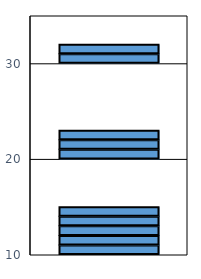
| Category | 9/1/2013 |
|---|---|
| 9/1/13 | 1 |
| 9/1/13 | 1 |
| 9/1/13 | 1 |
| 9/1/13 | 1 |
| 9/1/13 | 1 |
| 9/1/13 | 0 |
| 9/1/13 | 0 |
| 9/1/13 | 0 |
| 9/1/13 | 0 |
| 9/1/13 | 0 |
| 9/1/13 | 1 |
| 9/1/13 | 1 |
| 9/1/13 | 1 |
| 9/1/13 | 0 |
| 9/1/13 | 0 |
| 9/1/13 | 0 |
| 9/1/13 | 0 |
| 9/1/13 | 0 |
| 9/1/13 | 0 |
| 9/1/13 | 0 |
| 9/1/13 | 1 |
| 9/1/13 | 1 |